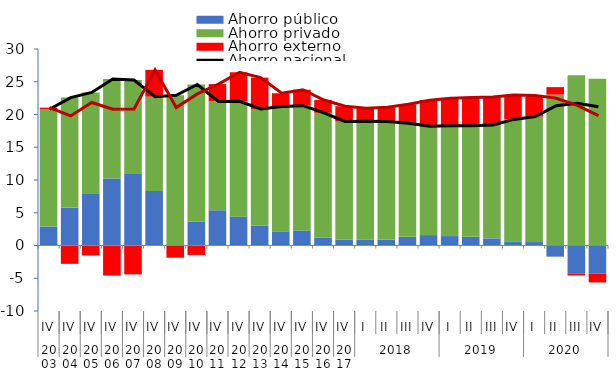
| Category | Ahorro público | Ahorro privado | Ahorro externo |
|---|---|---|---|
| 0 | 2.897 | 17.896 | 0.248 |
| 1 | 5.79 | 16.788 | -2.799 |
| 2 | 7.974 | 15.39 | -1.524 |
| 3 | 10.248 | 15.162 | -4.594 |
| 4 | 10.905 | 14.35 | -4.409 |
| 5 | 8.332 | 14.386 | 4.1 |
| 6 | 0.095 | 22.828 | -1.864 |
| 7 | 3.632 | 20.949 | -1.441 |
| 8 | 5.383 | 16.616 | 2.644 |
| 9 | 4.408 | 17.596 | 4.446 |
| 10 | 3.046 | 17.79 | 4.789 |
| 11 | 2.166 | 19.051 | 2.025 |
| 12 | 2.305 | 19.046 | 2.436 |
| 13 | 1.188 | 19.075 | 1.949 |
| 14 | 0.868 | 18.05 | 2.339 |
| 15 | 0.92 | 18.068 | 1.978 |
| 16 | 0.906 | 18.006 | 2.193 |
| 17 | 1.321 | 17.329 | 2.917 |
| 18 | 1.588 | 16.601 | 3.998 |
| 19 | 1.434 | 16.857 | 4.189 |
| 20 | 1.321 | 16.947 | 4.314 |
| 21 | 1.089 | 17.31 | 4.272 |
| 22 | 0.59 | 18.663 | 3.738 |
| 23 | 0.528 | 19.158 | 3.233 |
| 24 | -1.704 | 23.045 | 1.133 |
| 25 | -4.266 | 25.976 | -0.318 |
| 26 | -4.285 | 25.464 | -1.356 |